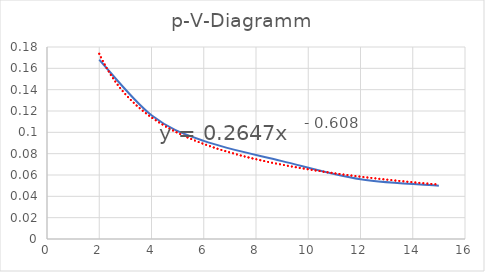
| Category | Series 0 |
|---|---|
| 15.0 | 0.05 |
| 12.0 | 0.056 |
| 9.0 | 0.073 |
| 6.0 | 0.092 |
| 4.0 | 0.116 |
| 2.0 | 0.168 |